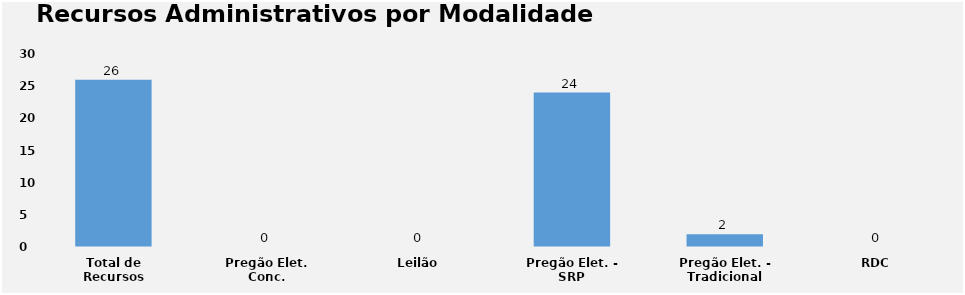
| Category | Series 0 |
|---|---|
| Total de Recursos | 26 |
| Pregão Elet. Conc. | 0 |
| Leilão | 0 |
| Pregão Elet. - SRP | 24 |
| Pregão Elet. - Tradicional | 2 |
| RDC | 0 |